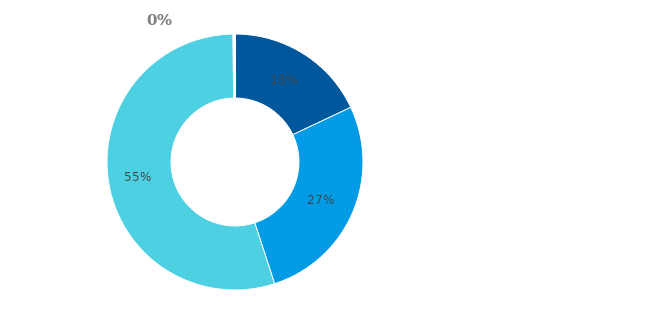
| Category | Series 3 |
|---|---|
| Hotovost | 0.18 |
| Půjčky poskytnuté nemovitostní společnosti | 0.27 |
| Majetkové účasti v nemovitostní společnosti | 0.548 |
| Ostatní finanční aktiva | 0.002 |